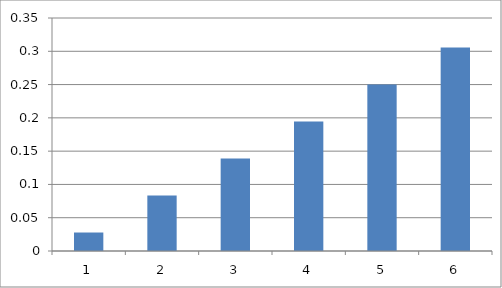
| Category | Series 0 |
|---|---|
| 0 | 0.028 |
| 1 | 0.083 |
| 2 | 0.139 |
| 3 | 0.194 |
| 4 | 0.25 |
| 5 | 0.306 |